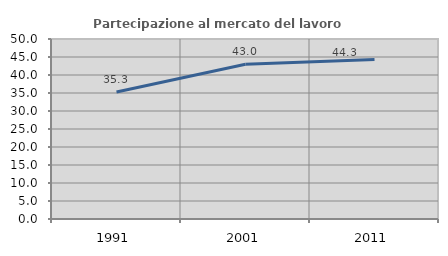
| Category | Partecipazione al mercato del lavoro  femminile |
|---|---|
| 1991.0 | 35.256 |
| 2001.0 | 42.998 |
| 2011.0 | 44.294 |